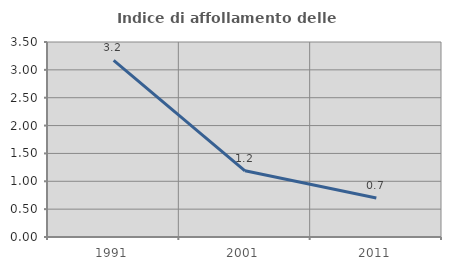
| Category | Indice di affollamento delle abitazioni  |
|---|---|
| 1991.0 | 3.169 |
| 2001.0 | 1.188 |
| 2011.0 | 0.7 |